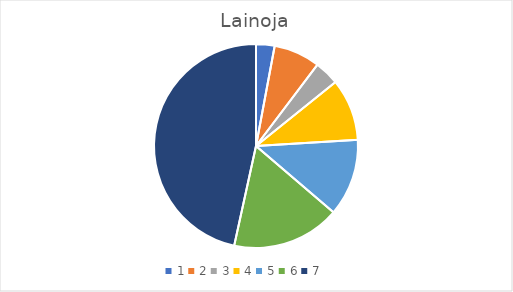
| Category | Lainoja |
|---|---|
| 0 | 6 |
| 1 | 15 |
| 2 | 8 |
| 3 | 20 |
| 4 | 25 |
| 5 | 35 |
| 6 | 95 |